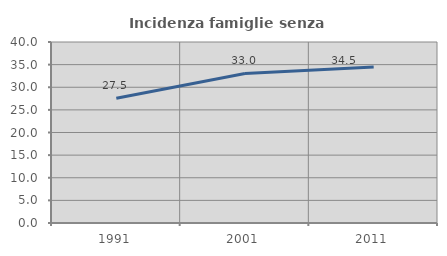
| Category | Incidenza famiglie senza nuclei |
|---|---|
| 1991.0 | 27.549 |
| 2001.0 | 33.039 |
| 2011.0 | 34.451 |